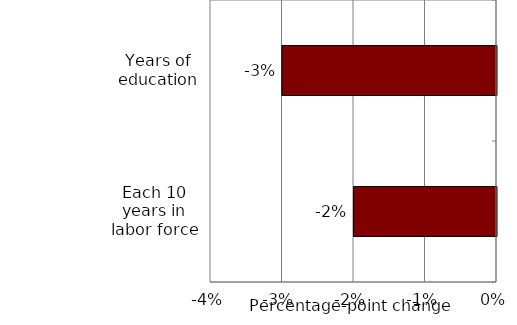
| Category | Series 0 |
|---|---|
| Each 10 years in labor force | -0.02 |
| Years of education | -0.03 |